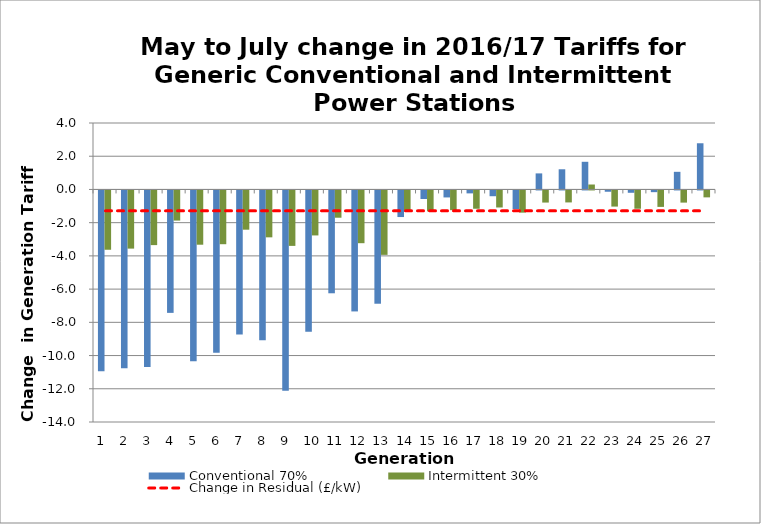
| Category | Conventional 70% | Intermittent 30% |
|---|---|---|
| 1.0 | -10.887 | -3.571 |
| 2.0 | -10.704 | -3.502 |
| 3.0 | -10.631 | -3.291 |
| 4.0 | -7.37 | -1.814 |
| 5.0 | -10.275 | -3.267 |
| 6.0 | -9.776 | -3.237 |
| 7.0 | -8.67 | -2.363 |
| 8.0 | -9.013 | -2.823 |
| 9.0 | -12.057 | -3.338 |
| 10.0 | -8.504 | -2.708 |
| 11.0 | -6.191 | -1.642 |
| 12.0 | -7.283 | -3.176 |
| 13.0 | -6.82 | -3.878 |
| 14.0 | -1.601 | -1.265 |
| 15.0 | -0.514 | -1.259 |
| 16.0 | -0.421 | -1.187 |
| 17.0 | -0.177 | -1.102 |
| 18.0 | -0.348 | -1.026 |
| 19.0 | -1.119 | -1.337 |
| 20.0 | 0.966 | -0.73 |
| 21.0 | 1.214 | -0.722 |
| 22.0 | 1.665 | 0.297 |
| 23.0 | -0.078 | -0.972 |
| 24.0 | -0.141 | -1.103 |
| 25.0 | -0.103 | -0.991 |
| 26.0 | 1.061 | -0.732 |
| 27.0 | 2.78 | -0.417 |